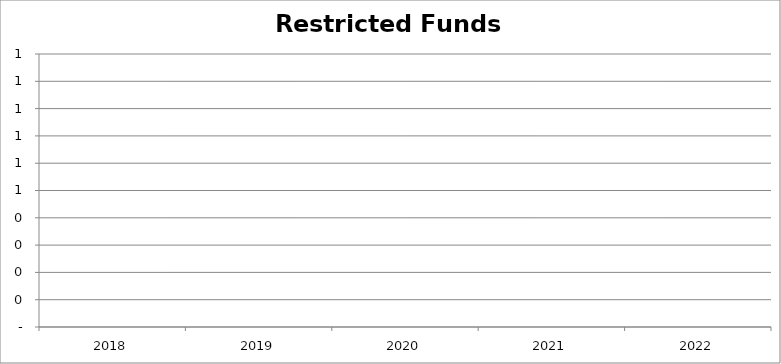
| Category | Restricted | Liability |
|---|---|---|
| 2018.0 | 0 |  |
| 2019.0 | 0 |  |
| 2020.0 | 0 |  |
| 2021.0 | 0 |  |
| 2022.0 | 0 |  |